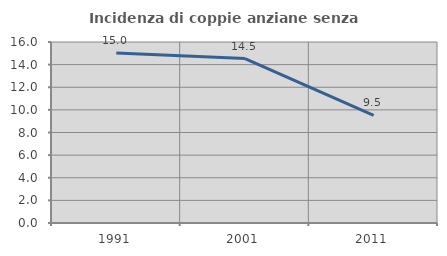
| Category | Incidenza di coppie anziane senza figli  |
|---|---|
| 1991.0 | 15.033 |
| 2001.0 | 14.54 |
| 2011.0 | 9.512 |